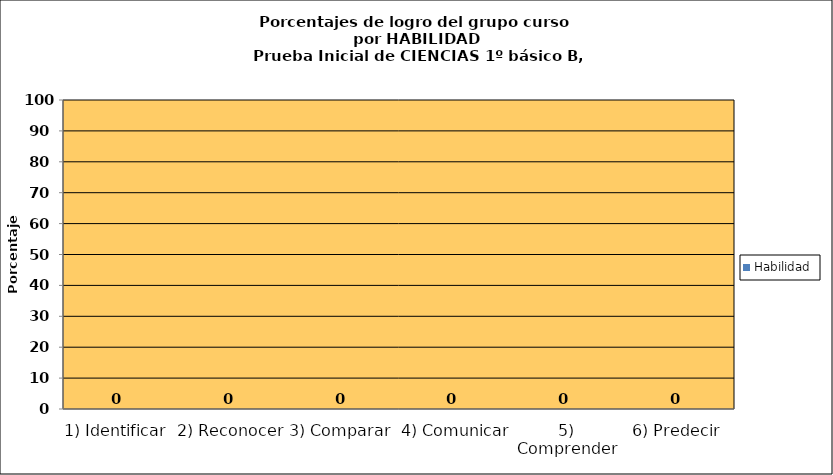
| Category | Habilidad |
|---|---|
| 1) Identificar | 0 |
| 2) Reconocer | 0 |
| 3) Comparar | 0 |
| 4) Comunicar | 0 |
| 5) Comprender | 0 |
| 6) Predecir | 0 |